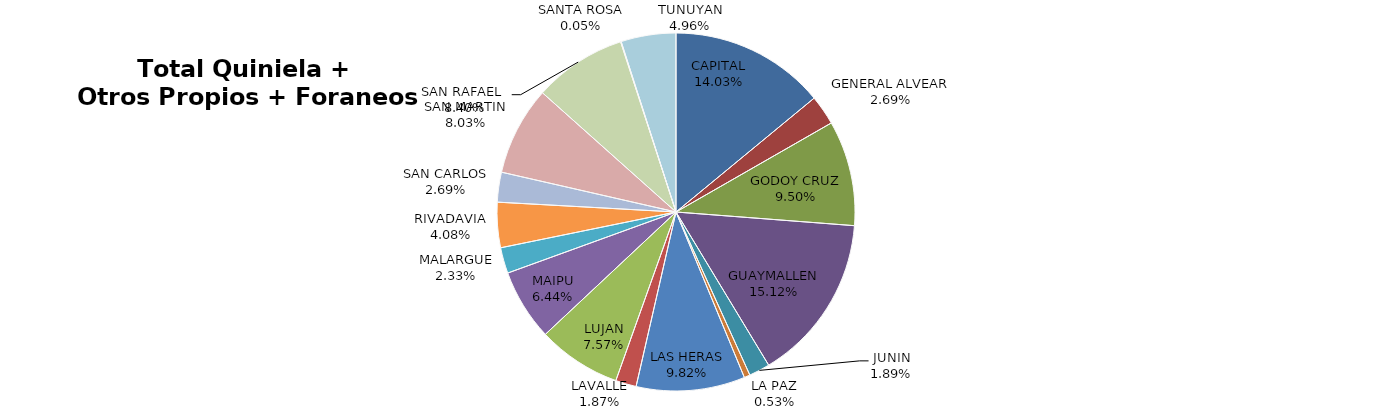
| Category | Total Quiniela + Otros Propios + Foraneos (Beneficio) |
|---|---|
| CAPITAL | 2874514.18 |
| GENERAL ALVEAR | 550798.79 |
| GODOY CRUZ | 1947557.57 |
| GUAYMALLEN | 3098241.04 |
| JUNIN | 388077.92 |
| LA PAZ | 108957.8 |
| LAS HERAS | 2011819.28 |
| LAVALLE | 384001.37 |
| LUJAN | 1550453.72 |
| MAIPU | 1319525.33 |
| MALARGUE | 478265.1 |
| RIVADAVIA | 837004.86 |
| SAN CARLOS | 551958.25 |
| SAN MARTIN | 1644735.16 |
| SAN RAFAEL  | 1720278.66 |
| SANTA ROSA | -10681.76 |
| TUNUYAN | 1015497.98 |